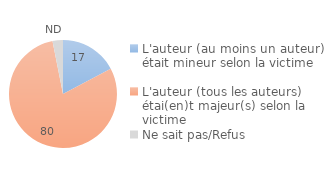
| Category | Series 0 |
|---|---|
| L'auteur (au moins un auteur) était mineur selon la victime | 17.25 |
| L'auteur (tous les auteurs) étai(en)t majeur(s) selon la victime | 79.627 |
| Ne sait pas/Refus | 3.123 |